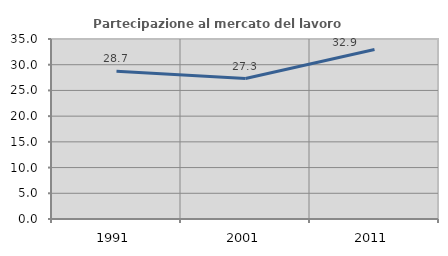
| Category | Partecipazione al mercato del lavoro  femminile |
|---|---|
| 1991.0 | 28.731 |
| 2001.0 | 27.319 |
| 2011.0 | 32.944 |